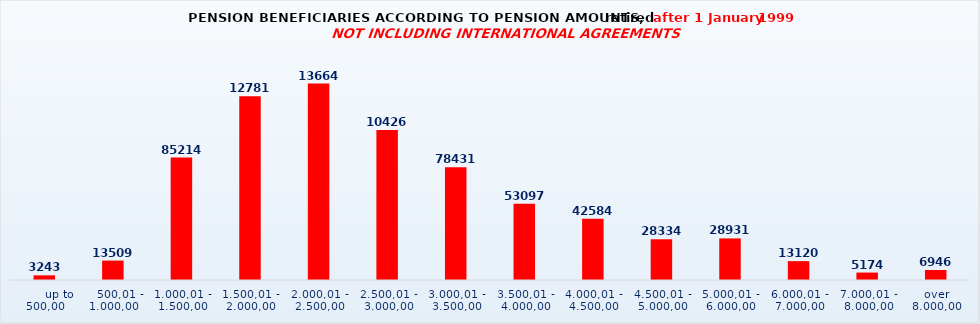
| Category | Series 0 |
|---|---|
|       up to 500,00 | 3243 |
|    500,01 - 1.000,00 | 13509 |
| 1.000,01 - 1.500,00 | 85214 |
| 1.500,01 - 2.000,00 | 127813 |
| 2.000,01 - 2.500,00 | 136642 |
| 2.500,01 - 3.000,00 | 104269 |
| 3.000,01 - 3.500,00 | 78431 |
| 3.500,01 - 4.000,00 | 53097 |
| 4.000,01 - 4.500,00 | 42584 |
| 4.500,01 - 5.000,00 | 28334 |
| 5.000,01 - 6.000,00 | 28931 |
| 6.000,01 - 7.000,00 | 13120 |
| 7.000,01 - 8.000,00 | 5174 |
| over 8.000,00 | 6946 |